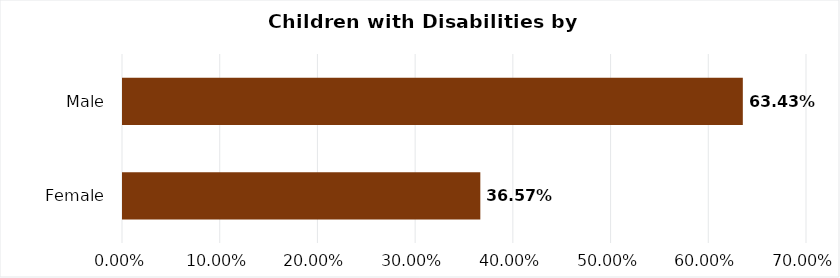
| Category | Series 0 |
|---|---|
| Female | 0.366 |
| Male | 0.634 |